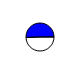
| Category | Series 0 |
|---|---|
| 0 | 5349043 |
| 1 | 5462094 |